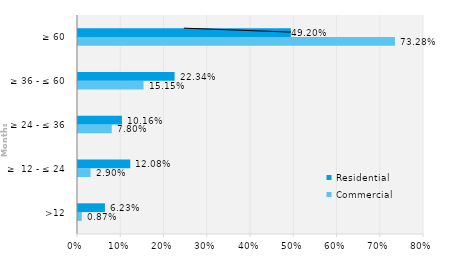
| Category | Commercial | Residential |
|---|---|---|
| >12 | 0.009 | 0.062 |
| ≥  12 - ≤ 24 | 0.029 | 0.121 |
| ≥ 24 - ≤ 36 | 0.078 | 0.102 |
| ≥ 36 - ≤ 60 | 0.152 | 0.223 |
| ≥ 60 | 0.733 | 0.492 |